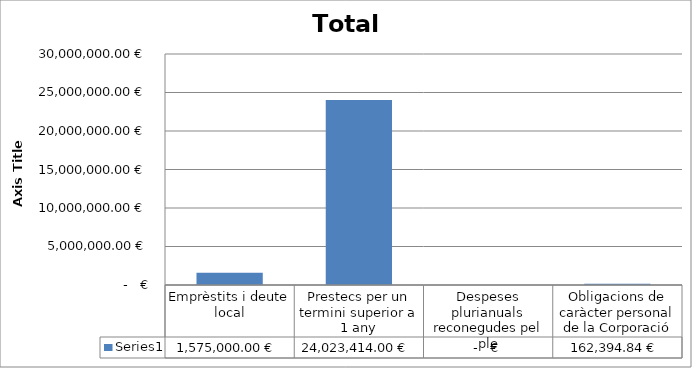
| Category | Series 0 |
|---|---|
| Emprèstits i deute local | 1575000 |
| Prestecs per un termini superior a 1 any | 24023414 |
| Despeses plurianuals reconegudes pel ple | 0 |
| Obligacions de caràcter personal de la Corporació | 162394.84 |